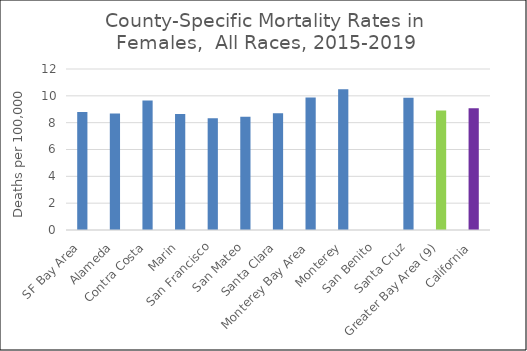
| Category | Female |
|---|---|
| SF Bay Area | 8.8 |
|   Alameda | 8.68 |
|   Contra Costa | 9.65 |
|   Marin | 8.64 |
|   San Francisco | 8.32 |
|   San Mateo | 8.45 |
|   Santa Clara | 8.7 |
| Monterey Bay Area | 9.88 |
|   Monterey | 10.49 |
|   San Benito | 0 |
|   Santa Cruz | 9.86 |
| Greater Bay Area (9) | 8.9 |
| California | 9.08 |